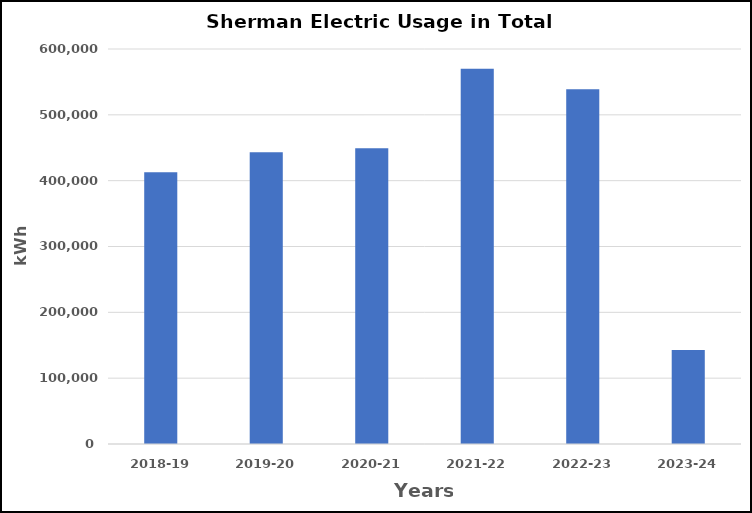
| Category | Series 0 |
|---|---|
| 2018-19 | 412863 |
| 2019-20 | 443288 |
| 2020-21 | 449183 |
| 2021-22 | 570071 |
| 2022-23 | 538963 |
| 2023-24 | 142762 |